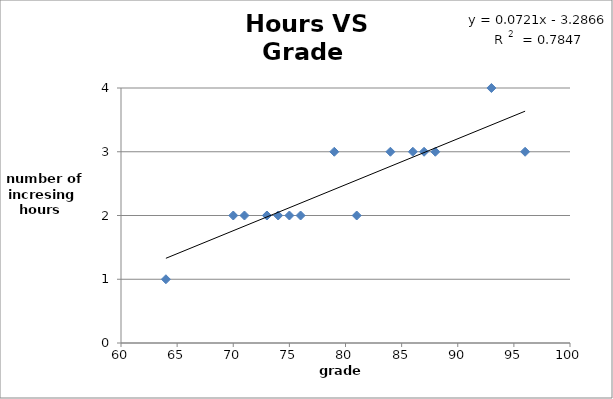
| Category | sorted hours  |
|---|---|
| 64.0 | 1 |
| 73.0 | 2 |
| 81.0 | 2 |
| 74.0 | 2 |
| 75.0 | 2 |
| 71.0 | 2 |
| 76.0 | 2 |
| 73.0 | 2 |
| 70.0 | 2 |
| 96.0 | 3 |
| 84.0 | 3 |
| 88.0 | 3 |
| 87.0 | 3 |
| 79.0 | 3 |
| 86.0 | 3 |
| 93.0 | 4 |